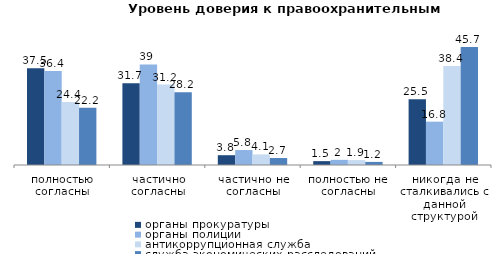
| Category | органы прокуратуры  | органы полиции  | антикоррупционная служба | служба экономических расследований  |
|---|---|---|---|---|
| полностью согласны | 37.5 | 36.4 | 24.4 | 22.2 |
| частично согласны | 31.7 | 39 | 31.2 | 28.2 |
| частично не согласны | 3.8 | 5.8 | 4.1 | 2.7 |
| полностью не согласны | 1.5 | 2 | 1.9 | 1.2 |
| никогда не сталкивались с данной структурой | 25.5 | 16.8 | 38.4 | 45.7 |